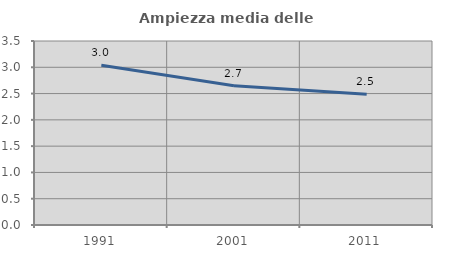
| Category | Ampiezza media delle famiglie |
|---|---|
| 1991.0 | 3.038 |
| 2001.0 | 2.65 |
| 2011.0 | 2.488 |